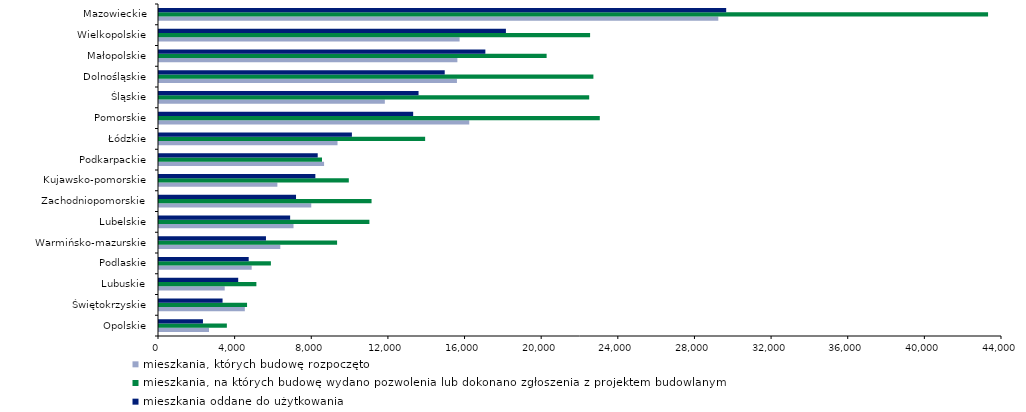
| Category | mieszkania, których budowę rozpoczęto | mieszkania, na których budowę wydano pozwolenia lub dokonano zgłoszenia z projektem budowlanym | mieszkania oddane do użytkowania |
|---|---|---|---|
| Opolskie | 2610 | 3542 | 2294 |
| Świętokrzyskie | 4480 | 4596 | 3318 |
| Lubuskie | 3430 | 5083 | 4134 |
| Podlaskie | 4838 | 5840 | 4682 |
| Warmińsko-mazurskie | 6331 | 9295 | 5583 |
| Lubelskie | 7021 | 10982 | 6845 |
| Zachodniopomorskie | 7947 | 11094 | 7152 |
| Kujawsko-pomorskie | 6179 | 9907 | 8161 |
| Podkarpackie | 8616 | 8508 | 8284 |
| Łódzkie | 9318 | 13891 | 10068 |
| Pomorskie | 16193 | 23006 | 13266 |
| Śląskie | 11787 | 22454 | 13547 |
| Dolnośląskie | 15551 | 22673 | 14913 |
| Małopolskie | 15574 | 20232 | 17034 |
| Wielkopolskie | 15690 | 22501 | 18107 |
| Mazowieckie | 29193 | 43273 | 29604 |